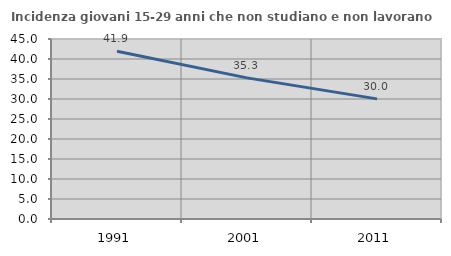
| Category | Incidenza giovani 15-29 anni che non studiano e non lavorano  |
|---|---|
| 1991.0 | 41.926 |
| 2001.0 | 35.279 |
| 2011.0 | 30.028 |